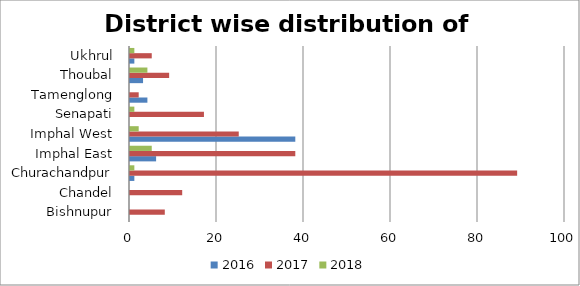
| Category | 2016 | 2017 | 2018 |
|---|---|---|---|
| Bishnupur | 0 | 8 | 0 |
| Chandel | 0 | 12 | 0 |
| Churachandpur | 1 | 89 | 1 |
| Imphal East | 6 | 38 | 5 |
| Imphal West | 38 | 25 | 2 |
| Senapati | 0 | 17 | 1 |
| Tamenglong | 4 | 2 | 0 |
| Thoubal | 3 | 9 | 4 |
| Ukhrul | 1 | 5 | 1 |